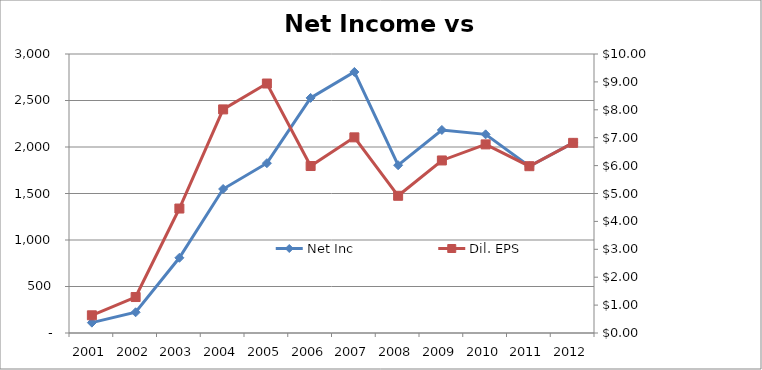
| Category | Net Inc |
|---|---|
| 2001.0 | 111.5 |
| 2002.0 | 222.9 |
| 2003.0 | 808.8 |
| 2004.0 | 1548.4 |
| 2005.0 | 1825.9 |
| 2006.0 | 2528 |
| 2007.0 | 2807 |
| 2008.0 | 1804 |
| 2009.0 | 2183 |
| 2010.0 | 2136 |
| 2011.0 | 1793.52 |
| 2012.0 | 2044.657 |